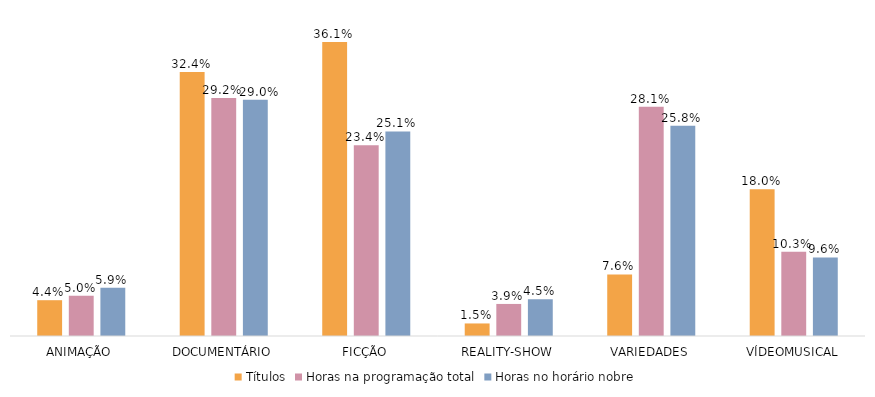
| Category | Títulos | Horas na programação total | Horas no horário nobre |
|---|---|---|---|
| ANIMAÇÃO | 0.044 | 0.05 | 0.059 |
| DOCUMENTÁRIO | 0.324 | 0.292 | 0.29 |
| FICÇÃO | 0.361 | 0.234 | 0.251 |
| REALITY-SHOW | 0.015 | 0.039 | 0.045 |
| VARIEDADES | 0.076 | 0.281 | 0.258 |
| VÍDEOMUSICAL | 0.18 | 0.103 | 0.096 |